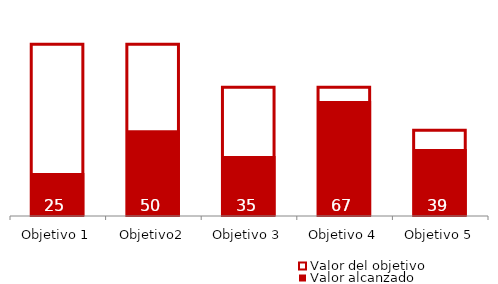
| Category | Valor del objetivo | Valor alcanzado |
|---|---|---|
| Objetivo 1 | 100 | 25 |
| Objetivo2 | 100 | 50 |
| Objetivo 3 | 75 | 35 |
| Objetivo 4 | 75 | 67 |
| Objetivo 5 | 50 | 39 |